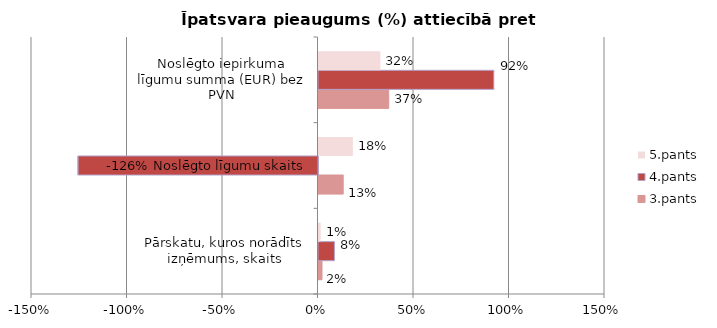
| Category | 3.pants | 4.pants | 5.pants |
|---|---|---|---|
| Pārskatu, kuros norādīts izņēmums, skaits | 0.018 | 0.083 | 0.011 |
| Noslēgto līgumu skaits | 0.129 | -1.256 | 0.18 |
| Noslēgto iepirkuma līgumu summa (EUR) bez PVN | 0.368 | 0.918 | 0.324 |